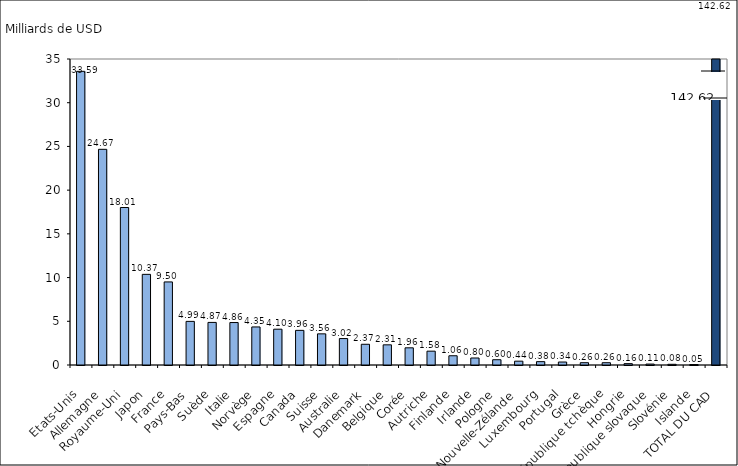
| Category | Series 0 |
|---|---|
| Etats-Unis | 33.589 |
| Allemagne | 24.67 |
| Royaume-Uni | 18.013 |
| Japon | 10.368 |
| France | 9.501 |
| Pays-Bas | 4.988 |
| Suède | 4.87 |
| Italie | 4.856 |
| Norvège | 4.352 |
| Espagne | 4.096 |
| Canada | 3.962 |
| Suisse | 3.563 |
| Australie | 3.025 |
| Danemark | 2.372 |
| Belgique | 2.306 |
| Corée | 1.965 |
| Autriche | 1.583 |
| Finlande | 1.057 |
| Irlande | 0.802 |
| Pologne | 0.603 |
| Nouvelle-Zélande | 0.438 |
| Luxembourg | 0.384 |
| Portugal | 0.34 |
| Grèce | 0.264 |
| République tchèque | 0.261 |
| Hongrie | 0.155 |
| République slovaque | 0.107 |
| Slovénie | 0.08 |
| Islande | 0.05 |
| TOTAL DU CAD | 142.619 |